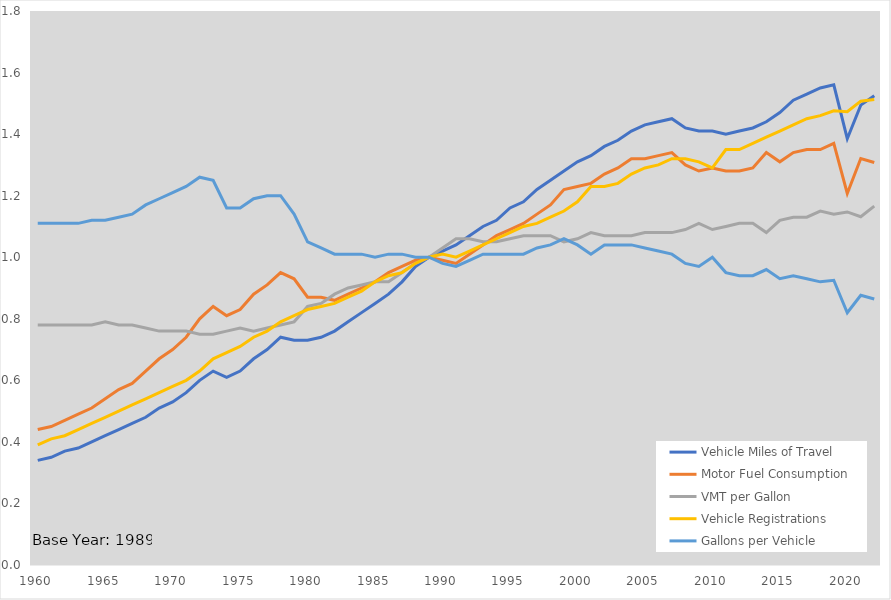
| Category | Vehicle Miles of Travel | Motor Fuel Consumption | VMT per Gallon | Vehicle Registrations | Gallons per Vehicle |
|---|---|---|---|---|---|
| 1960.0 | 0.34 | 0.44 | 0.78 | 0.39 | 1.11 |
| 1961.0 | 0.35 | 0.45 | 0.78 | 0.41 | 1.11 |
| 1962.0 | 0.37 | 0.47 | 0.78 | 0.42 | 1.11 |
| 1963.0 | 0.38 | 0.49 | 0.78 | 0.44 | 1.11 |
| 1964.0 | 0.4 | 0.51 | 0.78 | 0.46 | 1.12 |
| 1965.0 | 0.42 | 0.54 | 0.79 | 0.48 | 1.12 |
| 1966.0 | 0.44 | 0.57 | 0.78 | 0.5 | 1.13 |
| 1967.0 | 0.46 | 0.59 | 0.78 | 0.52 | 1.14 |
| 1968.0 | 0.48 | 0.63 | 0.77 | 0.54 | 1.17 |
| 1969.0 | 0.51 | 0.67 | 0.76 | 0.56 | 1.19 |
| 1970.0 | 0.53 | 0.7 | 0.76 | 0.58 | 1.21 |
| 1971.0 | 0.56 | 0.74 | 0.76 | 0.6 | 1.23 |
| 1972.0 | 0.6 | 0.8 | 0.75 | 0.63 | 1.26 |
| 1973.0 | 0.63 | 0.84 | 0.75 | 0.67 | 1.25 |
| 1974.0 | 0.61 | 0.81 | 0.76 | 0.69 | 1.16 |
| 1975.0 | 0.63 | 0.83 | 0.77 | 0.71 | 1.16 |
| 1976.0 | 0.67 | 0.88 | 0.76 | 0.74 | 1.19 |
| 1977.0 | 0.7 | 0.91 | 0.77 | 0.76 | 1.2 |
| 1978.0 | 0.74 | 0.95 | 0.78 | 0.79 | 1.2 |
| 1979.0 | 0.73 | 0.93 | 0.79 | 0.81 | 1.14 |
| 1980.0 | 0.73 | 0.87 | 0.84 | 0.83 | 1.05 |
| 1981.0 | 0.74 | 0.87 | 0.85 | 0.84 | 1.03 |
| 1982.0 | 0.76 | 0.86 | 0.88 | 0.85 | 1.01 |
| 1983.0 | 0.79 | 0.88 | 0.9 | 0.87 | 1.01 |
| 1984.0 | 0.82 | 0.9 | 0.91 | 0.89 | 1.01 |
| 1985.0 | 0.85 | 0.92 | 0.92 | 0.92 | 1 |
| 1986.0 | 0.88 | 0.95 | 0.92 | 0.94 | 1.01 |
| 1987.0 | 0.92 | 0.97 | 0.95 | 0.95 | 1.01 |
| 1988.0 | 0.97 | 0.99 | 0.98 | 0.98 | 1 |
| 1989.0 | 1 | 1 | 1 | 1 | 1 |
| 1990.0 | 1.02 | 0.99 | 1.03 | 1.01 | 0.98 |
| 1991.0 | 1.04 | 0.98 | 1.06 | 1 | 0.97 |
| 1992.0 | 1.07 | 1.01 | 1.06 | 1.02 | 0.99 |
| 1993.0 | 1.1 | 1.04 | 1.05 | 1.04 | 1.01 |
| 1994.0 | 1.12 | 1.07 | 1.05 | 1.06 | 1.01 |
| 1995.0 | 1.16 | 1.09 | 1.06 | 1.08 | 1.01 |
| 1996.0 | 1.18 | 1.11 | 1.07 | 1.1 | 1.01 |
| 1997.0 | 1.22 | 1.14 | 1.07 | 1.11 | 1.03 |
| 1998.0 | 1.25 | 1.17 | 1.07 | 1.13 | 1.04 |
| 1999.0 | 1.28 | 1.22 | 1.05 | 1.15 | 1.06 |
| 2000.0 | 1.31 | 1.23 | 1.06 | 1.18 | 1.04 |
| 2001.0 | 1.33 | 1.24 | 1.08 | 1.23 | 1.01 |
| 2002.0 | 1.36 | 1.27 | 1.07 | 1.23 | 1.04 |
| 2003.0 | 1.38 | 1.29 | 1.07 | 1.24 | 1.04 |
| 2004.0 | 1.41 | 1.32 | 1.07 | 1.27 | 1.04 |
| 2005.0 | 1.43 | 1.32 | 1.08 | 1.29 | 1.03 |
| 2006.0 | 1.44 | 1.33 | 1.08 | 1.3 | 1.02 |
| 2007.0 | 1.45 | 1.34 | 1.08 | 1.32 | 1.01 |
| 2008.0 | 1.42 | 1.3 | 1.09 | 1.32 | 0.98 |
| 2009.0 | 1.41 | 1.28 | 1.11 | 1.31 | 0.97 |
| 2010.0 | 1.41 | 1.29 | 1.09 | 1.29 | 1 |
| 2011.0 | 1.4 | 1.28 | 1.1 | 1.35 | 0.95 |
| 2012.0 | 1.41 | 1.28 | 1.11 | 1.35 | 0.94 |
| 2013.0 | 1.42 | 1.29 | 1.11 | 1.37 | 0.94 |
| 2014.0 | 1.44 | 1.34 | 1.08 | 1.39 | 0.96 |
| 2015.0 | 1.47 | 1.31 | 1.12 | 1.41 | 0.93 |
| 2016.0 | 1.51 | 1.34 | 1.13 | 1.43 | 0.94 |
| 2017.0 | 1.53 | 1.35 | 1.13 | 1.45 | 0.93 |
| 2018.0 | 1.55 | 1.35 | 1.15 | 1.46 | 0.92 |
| 2019.0 | 1.56 | 1.37 | 1.14 | 1.476 | 0.925 |
| 2020.0 | 1.385 | 1.207 | 1.147 | 1.473 | 0.82 |
| 2021.0 | 1.494 | 1.321 | 1.131 | 1.507 | 0.876 |
| 2022.0 | 1.525 | 1.308 | 1.166 | 1.513 | 0.864 |